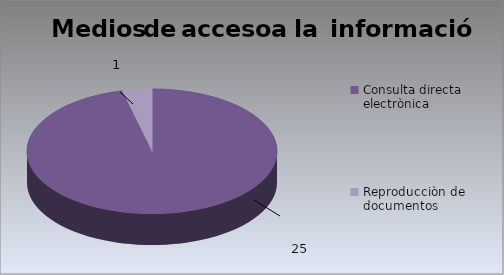
| Category | Series 0 |
|---|---|
| Consulta directa electrònica | 25 |
| Reproducciòn de documentos | 1 |